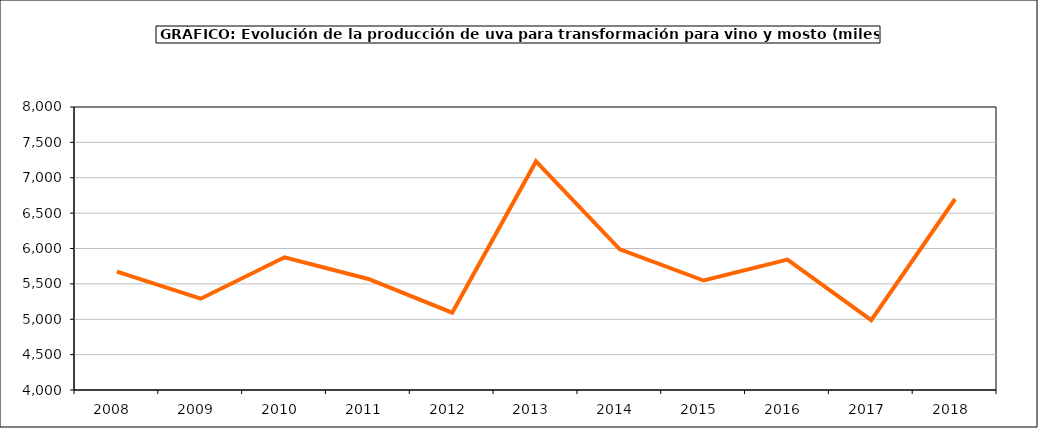
| Category | producción |
|---|---|
| 2008.0 | 5672.472 |
| 2009.0 | 5290.597 |
| 2010.0 | 5875.65 |
| 2011.0 | 5569.073 |
| 2012.0 | 5092.752 |
| 2013.0 | 7230.832 |
| 2014.0 | 5989.046 |
| 2015.0 | 5547.235 |
| 2016.0 | 5842.604 |
| 2017.0 | 4987.215 |
| 2018.0 | 6699.512 |